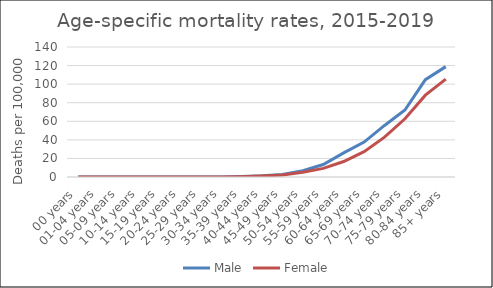
| Category | Male | Female |
|---|---|---|
| 00 years | 0 | 0 |
| 01-04 years | 0 | 0 |
| 05-09 years | 0 | 0 |
| 10-14 years | 0 | 0 |
| 15-19 years | 0 | 0 |
| 20-24 years | 0 | 0 |
| 25-29 years | 0 | 0 |
| 30-34 years | 0 | 0 |
| 35-39 years | 0.57 | 0.37 |
| 40-44 years | 1.33 | 1.12 |
| 45-49 years | 2.78 | 2.21 |
| 50-54 years | 6.7 | 5.02 |
| 55-59 years | 13.42 | 9.29 |
| 60-64 years | 25.98 | 16.68 |
| 65-69 years | 37.65 | 27.3 |
| 70-74 years | 55.53 | 42.88 |
| 75-79 years | 72.08 | 62.72 |
| 80-84 years | 104.85 | 88.15 |
| 85+ years | 118.88 | 105.41 |